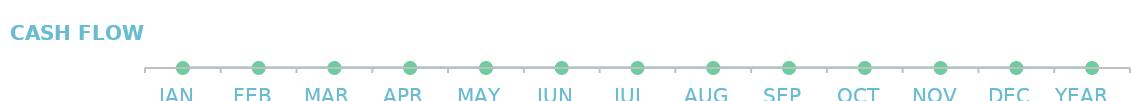
| Category | Cash Flow |
|---|---|
| jan  | 0 |
| feb  | 0 |
| mar  | 0 |
| apr  | 0 |
| may  | 0 |
| jun  | 0 |
| jul  | 0 |
| aug  | 0 |
| sep  | 0 |
| oct  | 0 |
| nov  | 0 |
| dec  | 0 |
| year   | 0 |